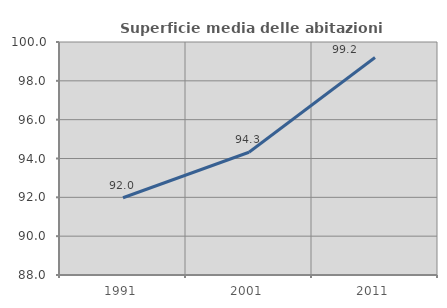
| Category | Superficie media delle abitazioni occupate |
|---|---|
| 1991.0 | 91.979 |
| 2001.0 | 94.321 |
| 2011.0 | 99.2 |